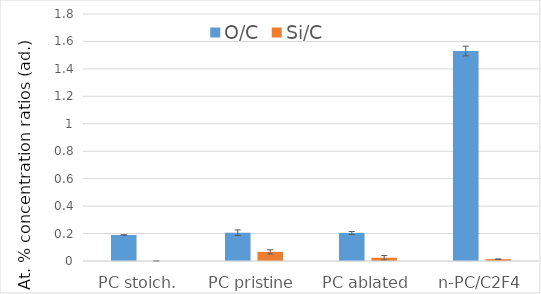
| Category | O/C | Si/C |
|---|---|---|
| PC stoich. | 0.19 | 0 |
| PC pristine | 0.206 | 0.067 |
| PC ablated | 0.205 | 0.024 |
| n-PC/C2F4 | 1.53 | 0.013 |